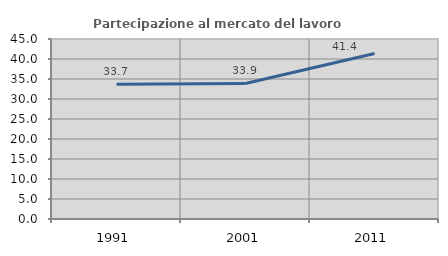
| Category | Partecipazione al mercato del lavoro  femminile |
|---|---|
| 1991.0 | 33.668 |
| 2001.0 | 33.892 |
| 2011.0 | 41.393 |